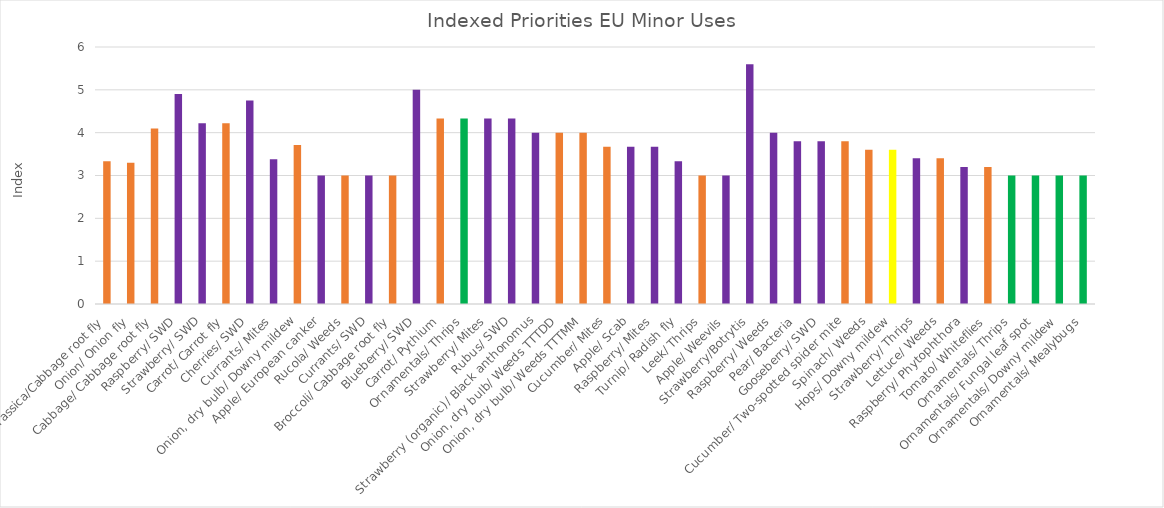
| Category | Index priorities |
|---|---|
| Brassica/Cabbage root fly | 3.33 |
| Onion/ Onion fly | 3.3 |
| Cabbage/ Cabbage root fly | 4.1 |
| Raspberry/ SWD | 4.9 |
| Strawberry/ SWD | 4.22 |
| Carrot/ Carrot fly | 4.22 |
| Cherries/ SWD | 4.75 |
| Currants/ Mites | 3.38 |
| Onion, dry bulb/ Downy mildew | 3.71 |
| Apple/ European canker | 3 |
| Rucola/ Weeds | 3 |
| Currants/ SWD | 3 |
| Broccoli/ Cabbage root fly | 3 |
| Blueberry/ SWD | 5 |
| Carrot/ Pythium | 4.33 |
| Ornamentals/ Thrips | 4.33 |
| Strawberry/ Mites | 4.33 |
| Rubus/ SWD | 4.33 |
| Strawberry (organic)/ Black anthonomus | 4 |
| Onion, dry bulb/ Weeds TTTDD | 4 |
| Onion, dry bulb/ Weeds TTTMM | 4 |
| Cucumber/ Mites | 3.67 |
| Apple/ Scab | 3.67 |
| Raspberry/ Mites | 3.67 |
| Turnip/ Radish fly | 3.33 |
| Leek/ Thrips | 3 |
| Apple/ Weevils | 3 |
| Strawberry/Botrytis | 5.6 |
| Raspberry/ Weeds | 4 |
| Pear/ Bacteria | 3.8 |
| Gooseberry/ SWD | 3.8 |
| Cucumber/ Two-spotted spider mite | 3.8 |
| Spinach/ Weeds | 3.6 |
| Hops/ Downy mildew | 3.6 |
| Strawberry/ Thrips | 3.4 |
| Lettuce/ Weeds | 3.4 |
| Raspberry/ Phytophthora | 3.2 |
| Tomato/ Whiteflies | 3.2 |
| Ornamentals/ Thrips | 3 |
| Ornamentals/ Fungal leaf spot | 3 |
| Ornamentals/ Downy mildew | 3 |
| Ornamentals/ Mealybugs | 3 |